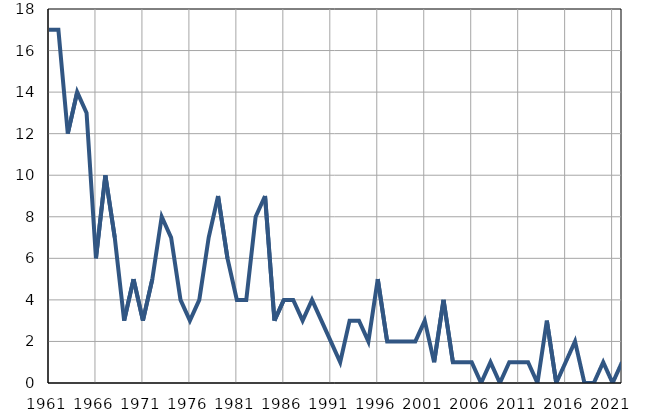
| Category | Умрла 
одојчад |
|---|---|
| 1961.0 | 17 |
| 1962.0 | 17 |
| 1963.0 | 12 |
| 1964.0 | 14 |
| 1965.0 | 13 |
| 1966.0 | 6 |
| 1967.0 | 10 |
| 1968.0 | 7 |
| 1969.0 | 3 |
| 1970.0 | 5 |
| 1971.0 | 3 |
| 1972.0 | 5 |
| 1973.0 | 8 |
| 1974.0 | 7 |
| 1975.0 | 4 |
| 1976.0 | 3 |
| 1977.0 | 4 |
| 1978.0 | 7 |
| 1979.0 | 9 |
| 1980.0 | 6 |
| 1981.0 | 4 |
| 1982.0 | 4 |
| 1983.0 | 8 |
| 1984.0 | 9 |
| 1985.0 | 3 |
| 1986.0 | 4 |
| 1987.0 | 4 |
| 1988.0 | 3 |
| 1989.0 | 4 |
| 1990.0 | 3 |
| 1991.0 | 2 |
| 1992.0 | 1 |
| 1993.0 | 3 |
| 1994.0 | 3 |
| 1995.0 | 2 |
| 1996.0 | 5 |
| 1997.0 | 2 |
| 1998.0 | 2 |
| 1999.0 | 2 |
| 2000.0 | 2 |
| 2001.0 | 3 |
| 2002.0 | 1 |
| 2003.0 | 4 |
| 2004.0 | 1 |
| 2005.0 | 1 |
| 2006.0 | 1 |
| 2007.0 | 0 |
| 2008.0 | 1 |
| 2009.0 | 0 |
| 2010.0 | 1 |
| 2011.0 | 1 |
| 2012.0 | 1 |
| 2013.0 | 0 |
| 2014.0 | 3 |
| 2015.0 | 0 |
| 2016.0 | 1 |
| 2017.0 | 2 |
| 2018.0 | 0 |
| 2019.0 | 0 |
| 2020.0 | 1 |
| 2021.0 | 0 |
| 2022.0 | 1 |